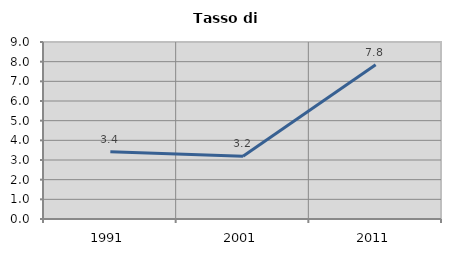
| Category | Tasso di disoccupazione   |
|---|---|
| 1991.0 | 3.414 |
| 2001.0 | 3.187 |
| 2011.0 | 7.847 |